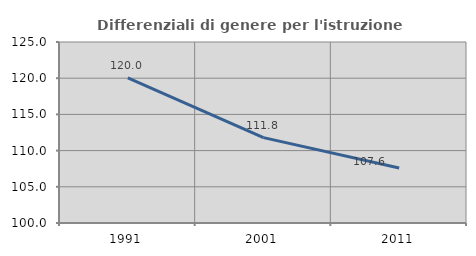
| Category | Differenziali di genere per l'istruzione superiore |
|---|---|
| 1991.0 | 120.045 |
| 2001.0 | 111.796 |
| 2011.0 | 107.587 |